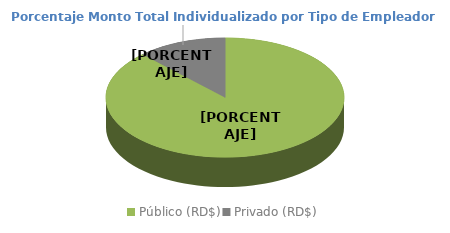
| Category | Series 0 |
|---|---|
| Público (RD$) | 0.878 |
| Privado (RD$) | 0.122 |